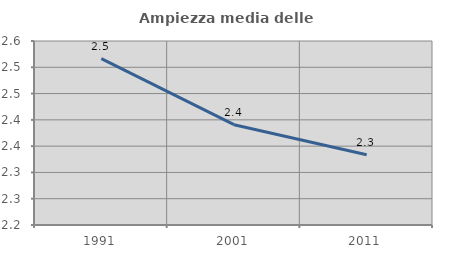
| Category | Ampiezza media delle famiglie |
|---|---|
| 1991.0 | 2.517 |
| 2001.0 | 2.391 |
| 2011.0 | 2.334 |